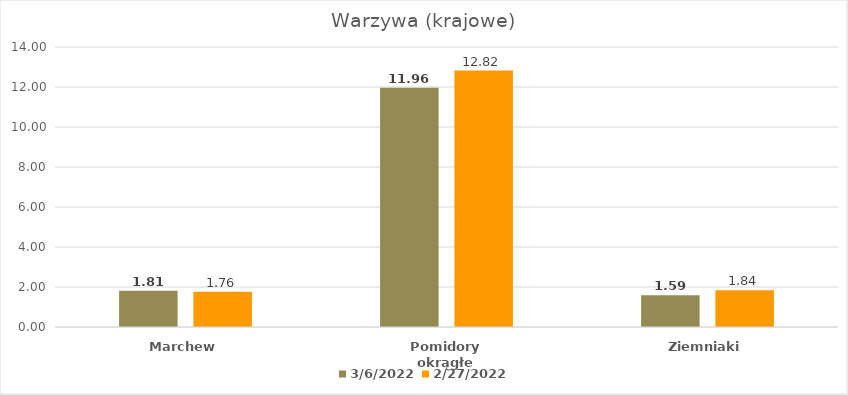
| Category | 06.03.2022 | 27.02.2022 |
|---|---|---|
| Marchew | 1.81 | 1.76 |
| Pomidory okrągłe | 11.96 | 12.82 |
| Ziemniaki | 1.59 | 1.84 |